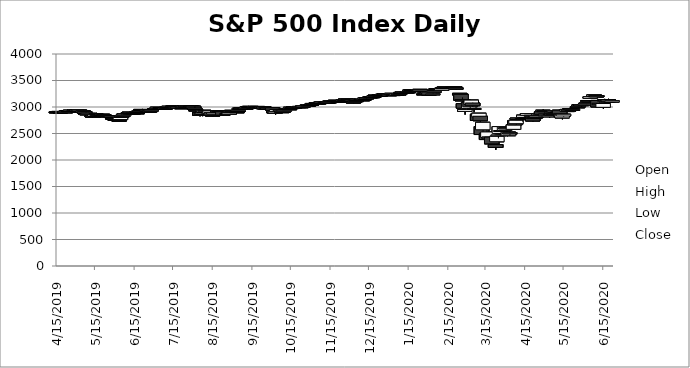
| Category | Open | High | Low | Close |
|---|---|---|---|---|
| 4/15/19 | 2908.32 | 2909.6 | 2896.48 | 2905.58 |
| 4/16/19 | 2912.26 | 2916.06 | 2900.71 | 2907.06 |
| 4/17/19 | 2916.04 | 2918 | 2895.45 | 2900.45 |
| 4/18/19 | 2904.81 | 2908.4 | 2891.9 | 2905.03 |
| 4/22/19 | 2898.78 | 2909.51 | 2896.35 | 2907.97 |
| 4/23/19 | 2909.99 | 2936.31 | 2908.53 | 2933.68 |
| 4/24/19 | 2934 | 2936.83 | 2926.05 | 2927.25 |
| 4/25/19 | 2928.99 | 2933.1 | 2912.84 | 2926.17 |
| 4/26/19 | 2925.81 | 2939.88 | 2917.56 | 2939.88 |
| 4/29/19 | 2940.58 | 2949.52 | 2939.35 | 2943.03 |
| 4/30/19 | 2937.14 | 2948.22 | 2924.11 | 2945.83 |
| 5/1/19 | 2952.33 | 2954.13 | 2923.36 | 2923.73 |
| 5/2/19 | 2922.16 | 2931.68 | 2900.5 | 2917.52 |
| 5/3/19 | 2929.21 | 2947.85 | 2929.21 | 2945.64 |
| 5/6/19 | 2908.89 | 2937.32 | 2898.21 | 2932.47 |
| 5/7/19 | 2913.03 | 2913.03 | 2862.6 | 2884.05 |
| 5/8/19 | 2879.61 | 2897.96 | 2873.28 | 2879.42 |
| 5/9/19 | 2859.84 | 2875.97 | 2836.4 | 2870.72 |
| 5/10/19 | 2863.1 | 2891.31 | 2825.39 | 2881.4 |
| 5/13/19 | 2840.19 | 2840.19 | 2801.43 | 2811.87 |
| 5/14/19 | 2820.12 | 2852.54 | 2820.12 | 2834.41 |
| 5/15/19 | 2820.38 | 2858.68 | 2815.08 | 2850.96 |
| 5/16/19 | 2855.8 | 2892.15 | 2855.8 | 2876.32 |
| 5/17/19 | 2858.6 | 2885.48 | 2854.23 | 2859.53 |
| 5/20/19 | 2841.94 | 2853.86 | 2831.29 | 2840.23 |
| 5/21/19 | 2854.02 | 2868.88 | 2854.02 | 2864.36 |
| 5/22/19 | 2856.06 | 2865.47 | 2851.11 | 2856.27 |
| 5/23/19 | 2836.7 | 2836.7 | 2805.49 | 2822.24 |
| 5/24/19 | 2832.41 | 2841.36 | 2820.19 | 2826.06 |
| 5/28/19 | 2830.03 | 2840.51 | 2801.88 | 2802.39 |
| 5/29/19 | 2790.25 | 2792.03 | 2766.06 | 2783.02 |
| 5/30/19 | 2786.94 | 2799 | 2776.74 | 2788.86 |
| 5/31/19 | 2766.15 | 2768.98 | 2750.52 | 2752.06 |
| 6/3/19 | 2751.53 | 2763.07 | 2728.81 | 2744.45 |
| 6/4/19 | 2762.64 | 2804.49 | 2762.64 | 2803.27 |
| 6/5/19 | 2818.09 | 2827.28 | 2800.92 | 2826.15 |
| 6/6/19 | 2828.51 | 2852.1 | 2822.45 | 2843.49 |
| 6/7/19 | 2852.87 | 2884.97 | 2852.87 | 2873.34 |
| 6/10/19 | 2885.83 | 2904.77 | 2885.51 | 2886.73 |
| 6/11/19 | 2903.27 | 2910.61 | 2878.53 | 2885.72 |
| 6/12/19 | 2882.73 | 2888.57 | 2874.68 | 2879.84 |
| 6/13/19 | 2886.24 | 2895.24 | 2881.99 | 2891.64 |
| 6/14/19 | 2886.82 | 2894.45 | 2879.62 | 2886.98 |
| 6/17/19 | 2889.75 | 2897.27 | 2887.3 | 2889.67 |
| 6/18/19 | 2906.71 | 2930.79 | 2905.44 | 2917.75 |
| 6/19/19 | 2920.55 | 2931.74 | 2911.43 | 2926.46 |
| 6/20/19 | 2949.6 | 2958.06 | 2931.5 | 2954.18 |
| 6/21/19 | 2952.71 | 2964.15 | 2946.87 | 2950.46 |
| 6/24/19 | 2951.42 | 2954.92 | 2944.05 | 2945.35 |
| 6/25/19 | 2945.78 | 2946.52 | 2916.01 | 2917.38 |
| 6/26/19 | 2926.07 | 2932.59 | 2912.99 | 2913.78 |
| 6/27/19 | 2919.66 | 2929.3 | 2918.57 | 2924.92 |
| 6/28/19 | 2932.94 | 2943.98 | 2929.05 | 2941.76 |
| 7/1/19 | 2971.41 | 2977.93 | 2952.22 | 2964.33 |
| 7/2/19 | 2964.66 | 2973.21 | 2955.92 | 2973.01 |
| 7/3/19 | 2978.08 | 2995.84 | 2977.96 | 2995.82 |
| 7/5/19 | 2984.25 | 2994.03 | 2967.97 | 2990.41 |
| 7/8/19 | 2979.77 | 2980.76 | 2970.09 | 2975.95 |
| 7/9/19 | 2965.52 | 2981.9 | 2963.44 | 2979.63 |
| 7/10/19 | 2989.3 | 3002.98 | 2984.62 | 2993.07 |
| 7/11/19 | 2999.62 | 3002.33 | 2988.8 | 2999.91 |
| 7/12/19 | 3003.36 | 3013.92 | 3001.87 | 3013.77 |
| 7/15/19 | 3017.8 | 3017.8 | 3008.77 | 3014.3 |
| 7/16/19 | 3012.13 | 3015.02 | 3001.15 | 3004.04 |
| 7/17/19 | 3005.1 | 3005.26 | 2984.25 | 2984.42 |
| 7/18/19 | 2978.87 | 2998.28 | 2973.09 | 2995.11 |
| 7/19/19 | 3004.26 | 3006.02 | 2975.86 | 2976.61 |
| 7/22/19 | 2981.93 | 2990.71 | 2976.65 | 2985.03 |
| 7/23/19 | 2994.74 | 3005.9 | 2988.56 | 3005.47 |
| 7/24/19 | 2998.77 | 3019.59 | 2996.82 | 3019.56 |
| 7/25/19 | 3016.26 | 3016.31 | 2997.24 | 3003.67 |
| 7/26/19 | 3013.25 | 3027.98 | 3012.79 | 3025.86 |
| 7/29/19 | 3024.47 | 3025.61 | 3014.3 | 3020.97 |
| 7/30/19 | 3007.66 | 3017.19 | 3000.94 | 3013.18 |
| 7/31/19 | 3016.22 | 3017.4 | 2958.08 | 2980.38 |
| 8/1/19 | 2980.32 | 3013.59 | 2945.23 | 2953.56 |
| 8/2/19 | 2943.9 | 2945.5 | 2914.11 | 2932.05 |
| 8/5/19 | 2898.07 | 2898.07 | 2822.12 | 2844.74 |
| 8/6/19 | 2861.18 | 2884.4 | 2847.42 | 2881.77 |
| 8/7/19 | 2858.65 | 2892.17 | 2825.71 | 2883.98 |
| 8/8/19 | 2896.21 | 2938.72 | 2894.58 | 2938.09 |
| 8/9/19 | 2930.51 | 2935.75 | 2900.15 | 2918.65 |
| 8/12/19 | 2907.07 | 2907.58 | 2873.14 | 2883.09 |
| 8/13/19 | 2880.72 | 2943.31 | 2877.05 | 2926.32 |
| 8/14/19 | 2894.15 | 2894.15 | 2839.64 | 2840.6 |
| 8/15/19 | 2846.2 | 2856.67 | 2825.51 | 2847.6 |
| 8/16/19 | 2864.74 | 2893.63 | 2864.74 | 2888.68 |
| 8/19/19 | 2913.48 | 2931 | 2913.48 | 2923.65 |
| 8/20/19 | 2919.01 | 2923.63 | 2899.6 | 2900.51 |
| 8/21/19 | 2922.04 | 2928.73 | 2917.91 | 2924.43 |
| 8/22/19 | 2930.94 | 2939.08 | 2904.51 | 2922.95 |
| 8/23/19 | 2911.07 | 2927.01 | 2834.97 | 2847.11 |
| 8/26/19 | 2866.7 | 2879.27 | 2856 | 2878.38 |
| 8/27/19 | 2893.14 | 2898.79 | 2860.59 | 2869.16 |
| 8/28/19 | 2861.28 | 2890.03 | 2853.05 | 2887.94 |
| 8/29/19 | 2910.37 | 2930.5 | 2905.67 | 2924.58 |
| 8/30/19 | 2937.09 | 2940.43 | 2913.32 | 2926.46 |
| 9/3/19 | 2909.01 | 2914.39 | 2891.85 | 2906.27 |
| 9/4/19 | 2924.67 | 2938.84 | 2921.86 | 2937.78 |
| 9/5/19 | 2960.6 | 2985.86 | 2960.6 | 2976 |
| 9/6/19 | 2980.33 | 2985.03 | 2972.51 | 2978.71 |
| 9/9/19 | 2988.43 | 2989.43 | 2969.39 | 2978.43 |
| 9/10/19 | 2971.01 | 2979.39 | 2957.01 | 2979.39 |
| 9/11/19 | 2981.41 | 3000.93 | 2975.31 | 3000.93 |
| 9/12/19 | 3009.08 | 3020.74 | 3000.92 | 3009.57 |
| 9/13/19 | 3012.21 | 3017.33 | 3002.9 | 3007.39 |
| 9/16/19 | 2996.41 | 3002.19 | 2990.67 | 2997.96 |
| 9/17/19 | 2995.67 | 3006.21 | 2993.73 | 3005.7 |
| 9/18/19 | 3001.5 | 3007.83 | 2978.57 | 3006.73 |
| 9/19/19 | 3010.36 | 3021.99 | 3003.16 | 3006.79 |
| 9/20/19 | 3008.42 | 3016.37 | 2984.68 | 2992.07 |
| 9/23/19 | 2983.5 | 2999.15 | 2982.23 | 2991.78 |
| 9/24/19 | 3002.43 | 3007.98 | 2957.73 | 2966.6 |
| 9/25/19 | 2968.35 | 2989.82 | 2952.86 | 2984.87 |
| 9/26/19 | 2985.73 | 2987.28 | 2963.71 | 2977.62 |
| 9/27/19 | 2985.47 | 2987.31 | 2945.53 | 2961.79 |
| 9/30/19 | 2967.07 | 2983.85 | 2967.07 | 2976.74 |
| 10/1/19 | 2983.69 | 2992.53 | 2938.7 | 2940.25 |
| 10/2/19 | 2924.78 | 2924.78 | 2874.93 | 2887.61 |
| 10/3/19 | 2885.38 | 2911.13 | 2855.96 | 2910.63 |
| 10/4/19 | 2918.56 | 2953.74 | 2918.56 | 2952.01 |
| 10/7/19 | 2944.23 | 2959.75 | 2935.68 | 2938.79 |
| 10/8/19 | 2920.4 | 2925.47 | 2892.71 | 2893.06 |
| 10/9/19 | 2911.1 | 2929.32 | 2907.41 | 2919.4 |
| 10/10/19 | 2918.55 | 2948.46 | 2917.12 | 2938.13 |
| 10/11/19 | 2963.07 | 2993.28 | 2963.07 | 2970.27 |
| 10/14/19 | 2965.81 | 2972.84 | 2962.94 | 2966.15 |
| 10/15/19 | 2973.61 | 3003.28 | 2973.61 | 2995.68 |
| 10/16/19 | 2989.68 | 2997.54 | 2985.2 | 2989.69 |
| 10/17/19 | 3000.77 | 3008.29 | 2991.79 | 2997.95 |
| 10/18/19 | 2996.84 | 3000 | 2976.31 | 2986.2 |
| 10/21/19 | 2996.48 | 3007.33 | 2995.35 | 3006.72 |
| 10/22/19 | 3010.73 | 3014.57 | 2995.54 | 2995.99 |
| 10/23/19 | 2994.01 | 3004.78 | 2991.21 | 3004.52 |
| 10/24/19 | 3014.78 | 3016.07 | 3000.42 | 3010.29 |
| 10/25/19 | 3003.32 | 3027.39 | 3001.94 | 3022.55 |
| 10/28/19 | 3032.12 | 3044.08 | 3032.12 | 3039.42 |
| 10/29/19 | 3035.39 | 3047.87 | 3034.81 | 3036.89 |
| 10/30/19 | 3039.74 | 3050.1 | 3028.39 | 3046.77 |
| 10/31/19 | 3046.9 | 3046.9 | 3023.19 | 3037.56 |
| 11/1/19 | 3050.72 | 3066.95 | 3050.72 | 3066.91 |
| 11/4/19 | 3078.96 | 3085.2 | 3074.87 | 3078.27 |
| 11/5/19 | 3080.8 | 3083.95 | 3072.15 | 3074.62 |
| 11/6/19 | 3075.1 | 3078.34 | 3065.89 | 3076.78 |
| 11/7/19 | 3087.02 | 3097.74 | 3080.23 | 3085.18 |
| 11/8/19 | 3081.25 | 3093.09 | 3074.12 | 3093.08 |
| 11/11/19 | 3080.33 | 3088.33 | 3075.82 | 3087.01 |
| 11/12/19 | 3089.28 | 3102.61 | 3084.73 | 3091.84 |
| 11/13/19 | 3084.18 | 3098.06 | 3078.8 | 3094.04 |
| 11/14/19 | 3090.75 | 3098.2 | 3083.26 | 3096.63 |
| 11/15/19 | 3107.92 | 3120.46 | 3104.6 | 3120.46 |
| 11/18/19 | 3117.91 | 3124.17 | 3112.06 | 3122.03 |
| 11/19/19 | 3127.45 | 3127.64 | 3113.47 | 3120.18 |
| 11/20/19 | 3114.66 | 3118.97 | 3091.41 | 3108.46 |
| 11/21/19 | 3108.49 | 3110.11 | 3094.55 | 3103.54 |
| 11/22/19 | 3111.41 | 3112.87 | 3099.26 | 3110.29 |
| 11/25/19 | 3117.44 | 3133.83 | 3117.44 | 3133.64 |
| 11/26/19 | 3134.85 | 3142.69 | 3131 | 3140.52 |
| 11/27/19 | 3145.49 | 3154.26 | 3143.41 | 3153.63 |
| 11/29/19 | 3147.18 | 3150.3 | 3139.34 | 3140.98 |
| 12/2/19 | 3143.85 | 3144.31 | 3110.78 | 3113.87 |
| 12/3/19 | 3087.41 | 3094.97 | 3070.49 | 3093.2 |
| 12/4/19 | 3103.5 | 3119.38 | 3102.53 | 3112.76 |
| 12/5/19 | 3119.21 | 3119.45 | 3103.76 | 3117.43 |
| 12/6/19 | 3134.62 | 3150.6 | 3134.62 | 3145.91 |
| 12/9/19 | 3141.86 | 3148.87 | 3135.46 | 3135.96 |
| 12/10/19 | 3135.36 | 3142.12 | 3126.09 | 3132.52 |
| 12/11/19 | 3135.75 | 3143.98 | 3133.21 | 3141.63 |
| 12/12/19 | 3141.23 | 3176.28 | 3138.47 | 3168.57 |
| 12/13/19 | 3166.65 | 3182.68 | 3156.51 | 3168.8 |
| 12/16/19 | 3183.63 | 3197.71 | 3183.63 | 3191.45 |
| 12/17/19 | 3195.4 | 3198.22 | 3191.03 | 3192.52 |
| 12/18/19 | 3195.21 | 3198.48 | 3191.14 | 3191.14 |
| 12/19/19 | 3192.32 | 3205.48 | 3192.32 | 3205.37 |
| 12/20/19 | 3223.33 | 3225.65 | 3216.03 | 3221.22 |
| 12/23/19 | 3226.05 | 3227.78 | 3222.3 | 3224.01 |
| 12/24/19 | 3225.45 | 3226.43 | 3220.51 | 3223.38 |
| 12/26/19 | 3227.2 | 3240.08 | 3227.2 | 3239.91 |
| 12/27/19 | 3247.23 | 3247.93 | 3234.37 | 3240.02 |
| 12/30/19 | 3240.09 | 3240.92 | 3216.57 | 3221.29 |
| 12/31/19 | 3215.18 | 3231.72 | 3212.03 | 3230.78 |
| 1/2/20 | 3244.67 | 3258.14 | 3235.53 | 3257.85 |
| 1/3/20 | 3226.36 | 3246.15 | 3222.34 | 3234.85 |
| 1/6/20 | 3217.55 | 3246.84 | 3214.64 | 3246.28 |
| 1/7/20 | 3241.86 | 3244.91 | 3232.43 | 3237.18 |
| 1/8/20 | 3238.59 | 3267.07 | 3236.67 | 3253.05 |
| 1/9/20 | 3266.03 | 3275.58 | 3263.67 | 3274.7 |
| 1/10/20 | 3281.81 | 3282.99 | 3260.86 | 3265.35 |
| 1/13/20 | 3271.13 | 3288.13 | 3268.43 | 3288.13 |
| 1/14/20 | 3285.35 | 3294.25 | 3277.19 | 3283.15 |
| 1/15/20 | 3282.27 | 3298.66 | 3280.69 | 3289.29 |
| 1/16/20 | 3302.97 | 3317.11 | 3302.82 | 3316.81 |
| 1/17/20 | 3323.66 | 3329.88 | 3318.86 | 3329.62 |
| 1/21/20 | 3321.03 | 3329.79 | 3316.61 | 3320.79 |
| 1/22/20 | 3330.02 | 3337.77 | 3320.04 | 3321.75 |
| 1/23/20 | 3315.77 | 3326.88 | 3301.87 | 3325.54 |
| 1/24/20 | 3333.1 | 3333.18 | 3281.53 | 3295.47 |
| 1/27/20 | 3247.16 | 3258.85 | 3234.5 | 3243.63 |
| 1/28/20 | 3255.35 | 3285.78 | 3253.22 | 3276.24 |
| 1/29/20 | 3289.46 | 3293.47 | 3271.89 | 3273.4 |
| 1/30/20 | 3256.45 | 3285.91 | 3242.8 | 3283.66 |
| 1/31/20 | 3282.33 | 3282.33 | 3214.68 | 3225.52 |
| 2/3/20 | 3235.66 | 3268.44 | 3235.66 | 3248.92 |
| 2/4/20 | 3280.61 | 3306.92 | 3280.61 | 3297.59 |
| 2/5/20 | 3324.91 | 3337.58 | 3313.75 | 3334.69 |
| 2/6/20 | 3344.92 | 3347.96 | 3334.39 | 3345.78 |
| 2/7/20 | 3335.54 | 3341.42 | 3322.12 | 3327.71 |
| 2/10/20 | 3318.28 | 3352.26 | 3317.77 | 3352.09 |
| 2/11/20 | 3365.87 | 3375.63 | 3352.72 | 3357.75 |
| 2/12/20 | 3370.5 | 3381.47 | 3369.72 | 3379.45 |
| 2/13/20 | 3365.9 | 3385.09 | 3360.52 | 3373.94 |
| 2/14/20 | 3378.08 | 3380.69 | 3366.15 | 3380.16 |
| 2/18/20 | 3369.04 | 3375.01 | 3355.61 | 3370.29 |
| 2/19/20 | 3380.39 | 3393.52 | 3378.83 | 3386.15 |
| 2/20/20 | 3380.45 | 3389.15 | 3341.05 | 3373.23 |
| 2/21/20 | 3360.5 | 3360.76 | 3328.45 | 3337.75 |
| 2/24/20 | 3257.61 | 3259.81 | 3214.65 | 3225.89 |
| 2/25/20 | 3238.94 | 3245.58 | 3118.77 | 3128.21 |
| 2/26/20 | 3139.9 | 3182.51 | 3108.99 | 3116.39 |
| 2/27/20 | 3062.54 | 3097.07 | 2977.39 | 2978.76 |
| 2/28/20 | 2916.9 | 2959.72 | 2855.84 | 2954.22 |
| 3/2/20 | 2974.28 | 3090.96 | 2945.82 | 3090.23 |
| 3/3/20 | 3096.46 | 3136.39 | 2977.24 | 3003.37 |
| 3/4/20 | 3045.75 | 3130.2 | 3034.38 | 3130.12 |
| 3/5/20 | 3075.7 | 3083.04 | 2999.83 | 3023.94 |
| 3/6/20 | 2954.2 | 2985.93 | 2901.54 | 2972.37 |
| 3/9/20 | 2863.89 | 2863.89 | 2734.43 | 2746.56 |
| 3/10/20 | 2813.48 | 2882.59 | 2734 | 2882.23 |
| 3/11/20 | 2825.6 | 2825.6 | 2707.22 | 2741.38 |
| 3/12/20 | 2630.86 | 2659.79 | 2479.9 | 2480.64 |
| 3/13/20 | 2569.99 | 2711.04 | 2492.37 | 2711.02 |
| 3/16/20 | 2508.59 | 2562.98 | 2381.12 | 2386.13 |
| 3/17/20 | 2425.66 | 2553.93 | 2367.04 | 2529.19 |
| 3/18/20 | 2436.5 | 2453.57 | 2280.52 | 2398.1 |
| 3/19/20 | 2393.48 | 2466.97 | 2319.78 | 2409.39 |
| 3/20/20 | 2431.94 | 2453.01 | 2295.56 | 2304.92 |
| 3/23/20 | 2290.71 | 2300.73 | 2191.86 | 2237.4 |
| 3/24/20 | 2344.44 | 2449.71 | 2344.44 | 2447.33 |
| 3/25/20 | 2457.77 | 2571.42 | 2407.53 | 2475.56 |
| 3/26/20 | 2501.29 | 2637.01 | 2500.72 | 2630.07 |
| 3/27/20 | 2555.87 | 2615.91 | 2520.02 | 2541.47 |
| 3/30/20 | 2558.98 | 2631.8 | 2545.28 | 2626.65 |
| 3/31/20 | 2614.69 | 2641.39 | 2571.15 | 2584.59 |
| 4/1/20 | 2498.08 | 2522.75 | 2447.49 | 2470.5 |
| 4/2/20 | 2458.54 | 2532.95 | 2455.79 | 2526.9 |
| 4/3/20 | 2514.92 | 2538.18 | 2459.96 | 2488.65 |
| 4/6/20 | 2578.28 | 2676.85 | 2574.57 | 2663.68 |
| 4/7/20 | 2738.65 | 2756.89 | 2657.67 | 2659.41 |
| 4/8/20 | 2685 | 2760.75 | 2663.3 | 2749.98 |
| 4/9/20 | 2776.99 | 2818.57 | 2762.36 | 2789.82 |
| 4/13/20 | 2782.46 | 2782.46 | 2721.17 | 2761.63 |
| 4/14/20 | 2805.1 | 2851.85 | 2805.1 | 2846.06 |
| 4/15/20 | 2795.64 | 2801.88 | 2761.54 | 2783.36 |
| 4/16/20 | 2799.34 | 2806.51 | 2764.32 | 2799.55 |
| 4/17/20 | 2842.43 | 2879.22 | 2830.88 | 2874.56 |
| 4/20/20 | 2845.62 | 2868.98 | 2820.43 | 2823.16 |
| 4/21/20 | 2784.81 | 2785.54 | 2727.1 | 2736.56 |
| 4/22/20 | 2787.89 | 2815.1 | 2775.95 | 2799.31 |
| 4/23/20 | 2810.42 | 2844.9 | 2794.26 | 2797.8 |
| 4/24/20 | 2812.64 | 2842.71 | 2791.76 | 2836.74 |
| 4/27/20 | 2854.65 | 2887.72 | 2852.89 | 2878.48 |
| 4/28/20 | 2909.96 | 2921.15 | 2860.71 | 2863.39 |
| 4/29/20 | 2918.46 | 2954.86 | 2912.16 | 2939.51 |
| 4/30/20 | 2930.91 | 2930.91 | 2892.47 | 2912.43 |
| 5/1/20 | 2869.09 | 2869.09 | 2821.61 | 2830.71 |
| 5/4/20 | 2815.01 | 2844.24 | 2797.85 | 2842.74 |
| 5/5/20 | 2868.88 | 2898.23 | 2863.55 | 2868.44 |
| 5/6/20 | 2883.14 | 2891.11 | 2847.65 | 2848.42 |
| 5/7/20 | 2878.26 | 2901.92 | 2876.48 | 2881.19 |
| 5/8/20 | 2908.83 | 2932.16 | 2902.88 | 2929.8 |
| 5/11/20 | 2915.46 | 2944.25 | 2903.44 | 2930.32 |
| 5/12/20 | 2939.5 | 2945.82 | 2869.59 | 2870.12 |
| 5/13/20 | 2865.86 | 2874.14 | 2793.15 | 2820 |
| 5/14/20 | 2794.54 | 2852.8 | 2766.64 | 2852.5 |
| 5/15/20 | 2829.95 | 2865.01 | 2816.78 | 2863.7 |
| 5/18/20 | 2913.86 | 2968.09 | 2913.86 | 2953.91 |
| 5/19/20 | 2948.59 | 2964.21 | 2922.41 | 2922.94 |
| 5/20/20 | 2953.63 | 2980.29 | 2953.63 | 2971.61 |
| 5/21/20 | 2969.95 | 2978.5 | 2938.57 | 2948.51 |
| 5/22/20 | 2948.05 | 2956.76 | 2933.59 | 2955.45 |
| 5/26/20 | 3004.08 | 3021.72 | 2988.17 | 2991.77 |
| 5/27/20 | 3015.65 | 3036.25 | 2969.75 | 3036.13 |
| 5/28/20 | 3046.61 | 3068.67 | 3023.4 | 3029.73 |
| 5/29/20 | 3025.17 | 3049.03 | 2998.61 | 3044.31 |
| 6/1/20 | 3038.78 | 3062.18 | 3031.54 | 3055.73 |
| 6/2/20 | 3064.78 | 3081.07 | 3051.64 | 3080.82 |
| 6/3/20 | 3098.9 | 3130.94 | 3098.9 | 3122.87 |
| 6/4/20 | 3111.56 | 3128.91 | 3090.41 | 3112.35 |
| 6/5/20 | 3163.84 | 3211.72 | 3163.84 | 3193.93 |
| 6/8/20 | 3199.92 | 3233.13 | 3196 | 3232.39 |
| 6/9/20 | 3213.32 | 3222.71 | 3193.11 | 3207.18 |
| 6/10/20 | 3213.42 | 3223.27 | 3181.49 | 3190.14 |
| 6/11/20 | 3123.53 | 3123.53 | 2999.49 | 3002.1 |
| 6/12/20 | 3071.04 | 3088.42 | 2984.47 | 3041.31 |
| 6/15/20 | 2993.76 | 3079.76 | 2965.66 | 3066.59 |
| 6/16/20 | 3131 | 3153.45 | 3078.36 | 3124.74 |
| 6/17/20 | 3136.13 | 3141.16 | 3108.03 | 3113.49 |
| 6/18/20 | 3101.64 | 3120 | 3093.51 | 3115.34 |
| 6/19/20 | 3140.29 | 3155.53 | 3083.11 | 3097.74 |
| 6/22/20 | 3094.42 | 3120.92 | 3079.39 | 3117.86 |